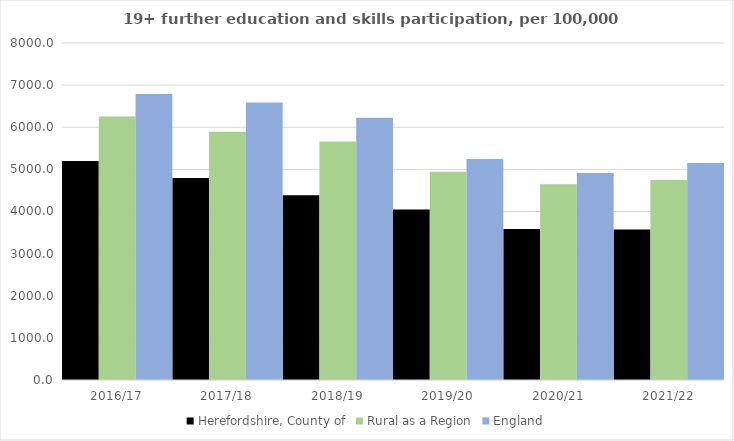
| Category | Herefordshire, County of | Rural as a Region | England |
|---|---|---|---|
| 2016/17 | 5199 | 6253.401 | 6788 |
| 2017/18 | 4797 | 5892.029 | 6588 |
| 2018/19 | 4386 | 5661.873 | 6227 |
| 2019/20 | 4050 | 4943.801 | 5244 |
| 2020/21 | 3582 | 4646.727 | 4913 |
| 2021/22 | 3574 | 4747.049 | 5151 |